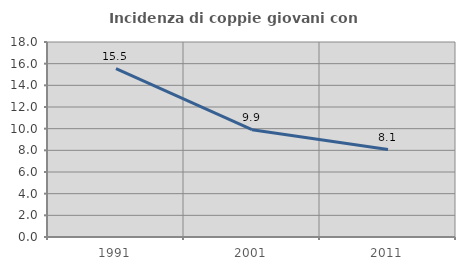
| Category | Incidenza di coppie giovani con figli |
|---|---|
| 1991.0 | 15.532 |
| 2001.0 | 9.901 |
| 2011.0 | 8.068 |